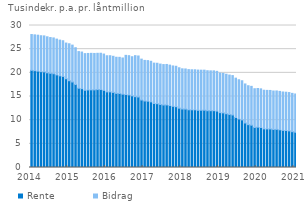
| Category | Rente | Bidrag |
|---|---|---|
| 2014-01-01 | 20.524 | 7.565 |
| 2014-02-01 | 20.46 | 7.564 |
| 2014-03-01 | 20.356 | 7.596 |
| 2014-04-01 | 20.251 | 7.587 |
| 2014-05-01 | 20.21 | 7.591 |
| 2014-06-01 | 20.008 | 7.605 |
| 2014-07-01 | 19.891 | 7.562 |
| 2014-08-01 | 19.808 | 7.562 |
| 2014-09-01 | 19.567 | 7.561 |
| 2014-10-01 | 19.369 | 7.543 |
| 2014-11-01 | 19.241 | 7.54 |
| 2014-12-01 | 18.751 | 7.536 |
| 2015-01-01 | 18.334 | 7.806 |
| 2015-02-01 | 18.06 | 7.795 |
| 2015-03-01 | 17.528 | 7.78 |
| 2015-04-01 | 16.75 | 7.737 |
| 2015-05-01 | 16.652 | 7.739 |
| 2015-06-01 | 16.317 | 7.742 |
| 2015-07-01 | 16.388 | 7.71 |
| 2015-08-01 | 16.409 | 7.71 |
| 2015-09-01 | 16.402 | 7.696 |
| 2015-10-01 | 16.462 | 7.664 |
| 2015-11-01 | 16.47 | 7.669 |
| 2015-12-01 | 16.302 | 7.663 |
| 2016-01-01 | 15.98 | 7.626 |
| 2016-02-01 | 15.983 | 7.631 |
| 2016-03-01 | 15.865 | 7.631 |
| 2016-04-01 | 15.655 | 7.637 |
| 2016-05-01 | 15.627 | 7.646 |
| 2016-06-01 | 15.49 | 7.644 |
| 2016-07-01 | 15.415 | 8.278 |
| 2016-08-01 | 15.342 | 8.283 |
| 2016-09-01 | 15.142 | 8.262 |
| 2016-10-01 | 14.967 | 8.661 |
| 2016-11-01 | 14.893 | 8.663 |
| 2016-12-01 | 14.255 | 8.64 |
| 2017-01-01 | 14.051 | 8.575 |
| 2017-02-01 | 14.007 | 8.577 |
| 2017-03-01 | 13.869 | 8.571 |
| 2017-04-01 | 13.521 | 8.532 |
| 2017-05-01 | 13.48 | 8.543 |
| 2017-06-01 | 13.309 | 8.541 |
| 2017-07-01 | 13.201 | 8.545 |
| 2017-08-01 | 13.221 | 8.55 |
| 2017-09-01 | 13.084 | 8.546 |
| 2017-10-01 | 12.928 | 8.529 |
| 2017-11-01 | 12.848 | 8.538 |
| 2017-12-01 | 12.538 | 8.532 |
| 2018-01-01 | 12.36 | 8.487 |
| 2018-02-01 | 12.338 | 8.482 |
| 2018-03-01 | 12.195 | 8.483 |
| 2018-04-01 | 12.194 | 8.451 |
| 2018-05-01 | 12.19 | 8.452 |
| 2018-06-01 | 12.089 | 8.493 |
| 2018-07-01 | 12.106 | 8.454 |
| 2018-08-01 | 12.11 | 8.454 |
| 2018-09-01 | 11.996 | 8.447 |
| 2018-10-01 | 12.002 | 8.417 |
| 2018-11-01 | 12.005 | 8.414 |
| 2018-12-01 | 11.916 | 8.4 |
| 2019-01-01 | 11.591 | 8.36 |
| 2019-02-01 | 11.543 | 8.357 |
| 2019-03-01 | 11.362 | 8.343 |
| 2019-04-01 | 11.202 | 8.327 |
| 2019-05-01 | 11.097 | 8.32 |
| 2019-06-01 | 10.57 | 8.306 |
| 2019-07-01 | 10.258 | 8.281 |
| 2019-08-01 | 10.056 | 8.269 |
| 2019-09-01 | 9.402 | 8.246 |
| 2019-10-01 | 9.051 | 8.224 |
| 2019-11-01 | 8.93 | 8.214 |
| 2019-12-01 | 8.445 | 8.196 |
| 2020-01-01 | 8.52 | 8.175 |
| 2020-02-01 | 8.446 | 8.169 |
| 2020-03-01 | 8.17 | 8.151 |
| 2020-04-01 | 8.158 | 8.133 |
| 2020-05-01 | 8.146 | 8.133 |
| 2020-06-01 | 8.028 | 8.131 |
| 2020-07-01 | 8.057 | 8.115 |
| 2020-08-01 | 7.966 | 8.111 |
| 2020-09-01 | 7.843 | 8.108 |
| 2020-10-01 | 7.812 | 8.094 |
| 2020-11-01 | 7.742 | 8.092 |
| 2020-12-01 | 7.569 | 8.092 |
| 2021-01-01 | 7.45 | 8.082 |